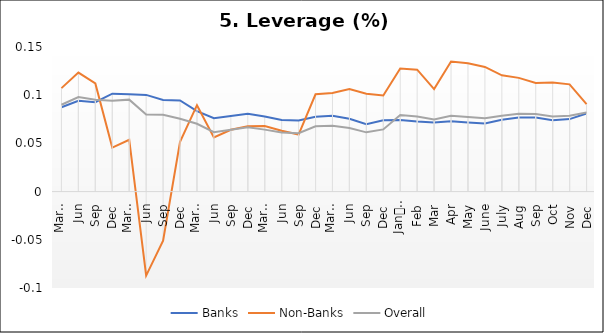
| Category | Banks | Non-Banks | Overall |
|---|---|---|---|
| 0 | 0.088 | 0.107 | 0.09 |
| 1 | 0.094 | 0.123 | 0.098 |
| 2 | 0.093 | 0.112 | 0.095 |
| 3 | 0.102 | 0.046 | 0.094 |
| 4 | 0.101 | 0.054 | 0.095 |
| 5 | 0.1 | -0.087 | 0.08 |
| 6 | 0.095 | -0.051 | 0.08 |
| 7 | 0.095 | 0.052 | 0.076 |
| 8 | 0.084 | 0.09 | 0.07 |
| 9 | 0.076 | 0.056 | 0.062 |
| 10 | 0.079 | 0.064 | 0.064 |
| 11 | 0.081 | 0.068 | 0.067 |
| 12 | 0.078 | 0.068 | 0.064 |
| 13 | 0.074 | 0.063 | 0.061 |
| 14 | 0.074 | 0.059 | 0.061 |
| 15 | 0.078 | 0.101 | 0.068 |
| 16 | 0.079 | 0.102 | 0.068 |
| 17 | 0.075 | 0.106 | 0.066 |
| 18 | 0.07 | 0.102 | 0.061 |
| 19 | 0.074 | 0.1 | 0.064 |
| 20 | 0.074 | 0.128 | 0.079 |
| 21 | 0.073 | 0.126 | 0.078 |
| 22 | 0.072 | 0.106 | 0.075 |
| 23 | 0.073 | 0.135 | 0.079 |
| 24 | 0.072 | 0.133 | 0.077 |
| 25 | 0.071 | 0.129 | 0.076 |
| 26 | 0.074 | 0.121 | 0.079 |
| 27 | 0.077 | 0.118 | 0.081 |
| 28 | 0.077 | 0.113 | 0.08 |
| 29 | 0.074 | 0.113 | 0.078 |
| 30 | 0.075 | 0.111 | 0.079 |
| 31 | 0.081 | 0.091 | 0.082 |